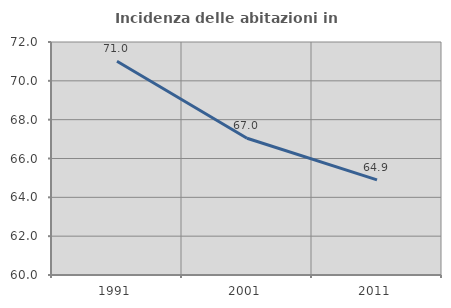
| Category | Incidenza delle abitazioni in proprietà  |
|---|---|
| 1991.0 | 71.009 |
| 2001.0 | 67.04 |
| 2011.0 | 64.898 |